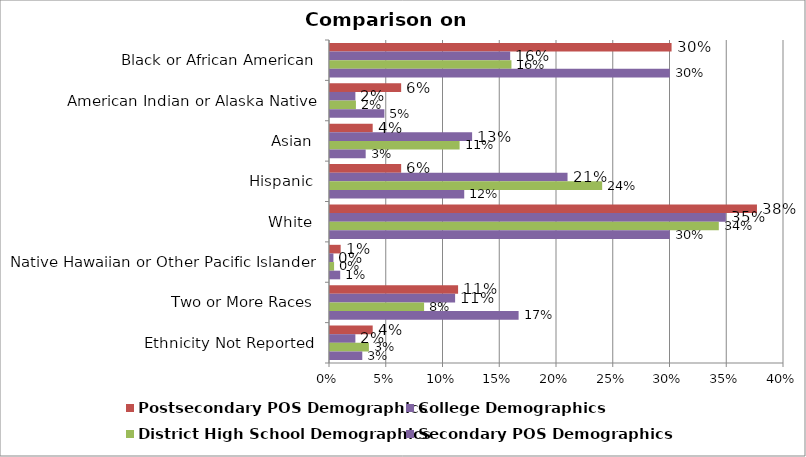
| Category | Postsecondary POS Demographics | College Demographics | District High School Demographics | Secondary POS Demographics |
|---|---|---|---|---|
| Black or African American | 0.301 | 0.159 | 0.16 | 0.299 |
| American Indian or Alaska Native | 0.063 | 0.022 | 0.023 | 0.048 |
| Asian | 0.038 | 0.125 | 0.114 | 0.031 |
| Hispanic | 0.063 | 0.209 | 0.24 | 0.118 |
| White | 0.376 | 0.349 | 0.343 | 0.299 |
| Native Hawaiian or Other Pacific Islander | 0.009 | 0.003 | 0.004 | 0.009 |
| Two or More Races | 0.113 | 0.11 | 0.083 | 0.166 |
| Ethnicity Not Reported | 0.038 | 0.022 | 0.034 | 0.028 |